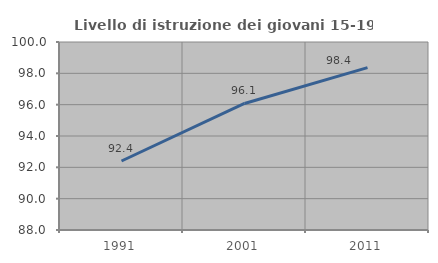
| Category | Livello di istruzione dei giovani 15-19 anni |
|---|---|
| 1991.0 | 92.405 |
| 2001.0 | 96.078 |
| 2011.0 | 98.361 |